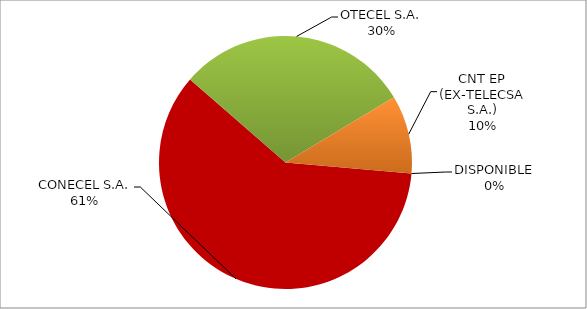
| Category | CÓDIGO DE RED 99 |
|---|---|
| CONECEL S.A. | 0.6 |
| OTECEL S.A. | 0.3 |
| CNT EP (EX-TELECSA S.A.) | 0.1 |
| DISPONIBLE | 0 |